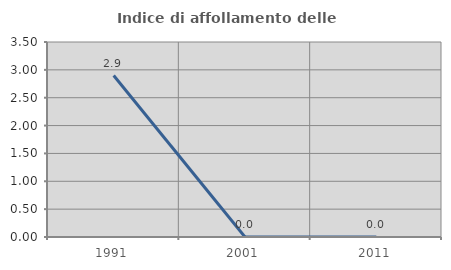
| Category | Indice di affollamento delle abitazioni  |
|---|---|
| 1991.0 | 2.899 |
| 2001.0 | 0 |
| 2011.0 | 0 |